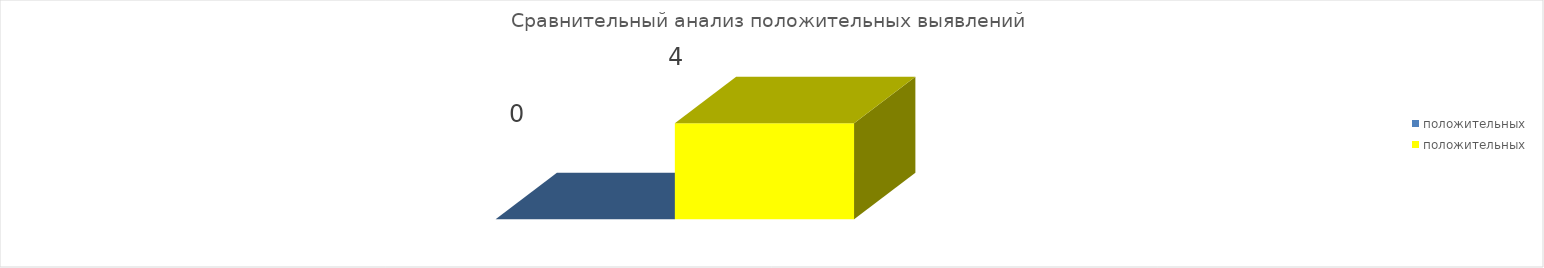
| Category | положительных |
|---|---|
| 0 | 4 |